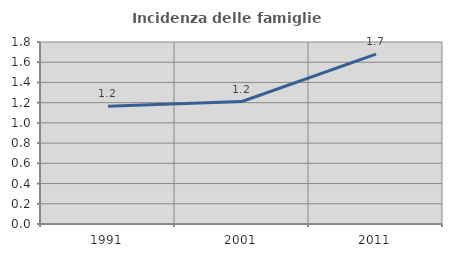
| Category | Incidenza delle famiglie numerose |
|---|---|
| 1991.0 | 1.164 |
| 2001.0 | 1.211 |
| 2011.0 | 1.68 |